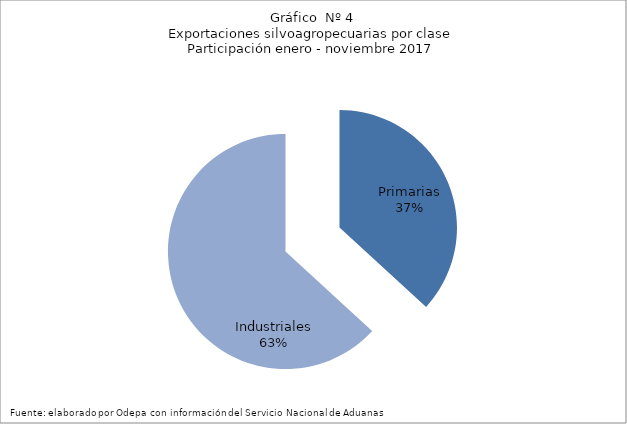
| Category | Series 0 |
|---|---|
| Primarias | 5315896 |
| Industriales | 9127602 |